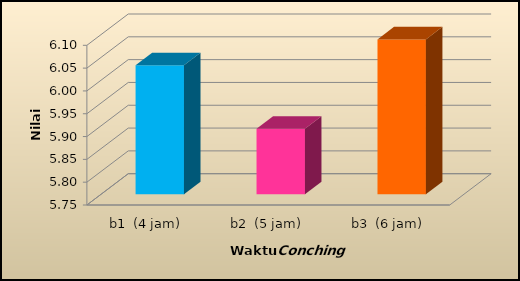
| Category | Nilai rata-rata |
|---|---|
| b1  (4 jam) | 6.033 |
| b2  (5 jam) | 5.894 |
| b3  (6 jam) | 6.089 |